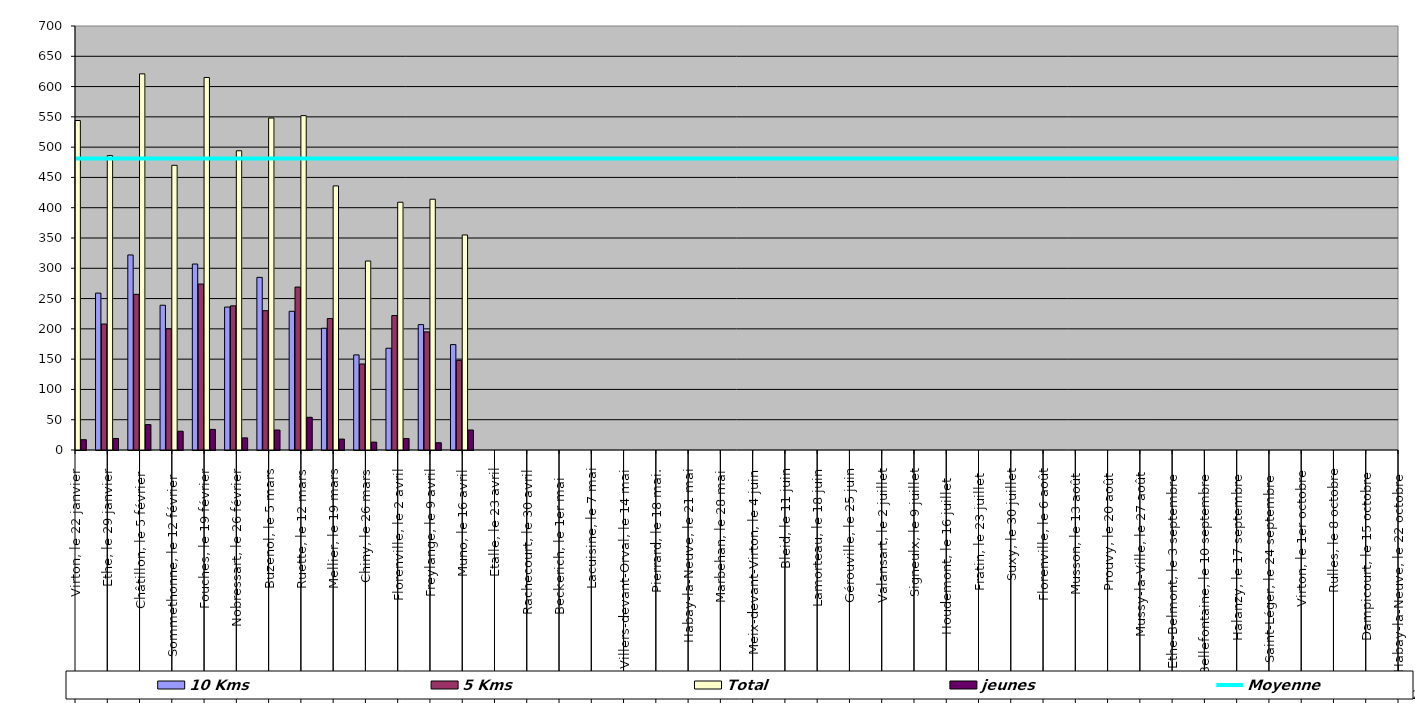
| Category | 10 Kms | 5 Kms | Total | jeunes |
|---|---|---|---|---|
| 0 | 296 | 231 | 544 | 17 |
| 1 | 259 | 208 | 486 | 19 |
| 2 | 322 | 257 | 621 | 42 |
| 3 | 239 | 200 | 470 | 31 |
| 4 | 307 | 274 | 615 | 34 |
| 5 | 236 | 238 | 494 | 20 |
| 6 | 285 | 230 | 548 | 33 |
| 7 | 229 | 269 | 552 | 54 |
| 8 | 201 | 217 | 436 | 18 |
| 9 | 157 | 142 | 312 | 13 |
| 10 | 168 | 222 | 409 | 19 |
| 11 | 207 | 195 | 414 | 12 |
| 12 | 174 | 148 | 355 | 33 |
| 13 | 0 | 0 | 0 | 0 |
| 14 | 0 | 0 | 0 | 0 |
| 15 | 0 | 0 | 0 | 0 |
| 16 | 0 | 0 | 0 | 0 |
| 17 | 0 | 0 | 0 | 0 |
| 18 | 0 | 0 | 0 | 0 |
| 19 | 0 | 0 | 0 | 0 |
| 20 | 0 | 0 | 0 | 0 |
| 21 | 0 | 0 | 0 | 0 |
| 22 | 0 | 0 | 0 | 0 |
| 23 | 0 | 0 | 0 | 0 |
| 24 | 0 | 0 | 0 | 0 |
| 25 | 0 | 0 | 0 | 0 |
| 26 | 0 | 0 | 0 | 0 |
| 27 | 0 | 0 | 0 | 0 |
| 28 | 0 | 0 | 0 | 0 |
| 29 | 0 | 0 | 0 | 0 |
| 30 | 0 | 0 | 0 | 0 |
| 31 | 0 | 0 | 0 | 0 |
| 32 | 0 | 0 | 0 | 0 |
| 33 | 0 | 0 | 0 | 0 |
| 34 | 0 | 0 | 0 | 0 |
| 35 | 0 | 0 | 0 | 0 |
| 36 | 0 | 0 | 0 | 0 |
| 37 | 0 | 0 | 0 | 0 |
| 38 | 0 | 0 | 0 | 0 |
| 39 | 0 | 0 | 0 | 0 |
| 40 | 0 | 0 | 0 | 0 |
| 41 | 0 | 0 | 0 | 0 |